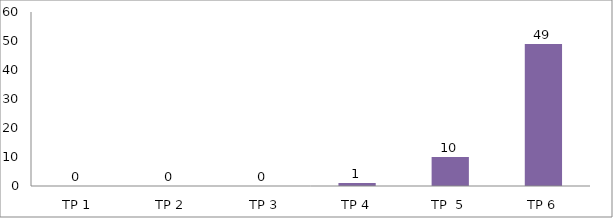
| Category | BIL. MURID |
|---|---|
| TP 1 | 0 |
| TP 2 | 0 |
|  TP 3 | 0 |
| TP 4 | 1 |
| TP  5 | 10 |
| TP 6 | 49 |